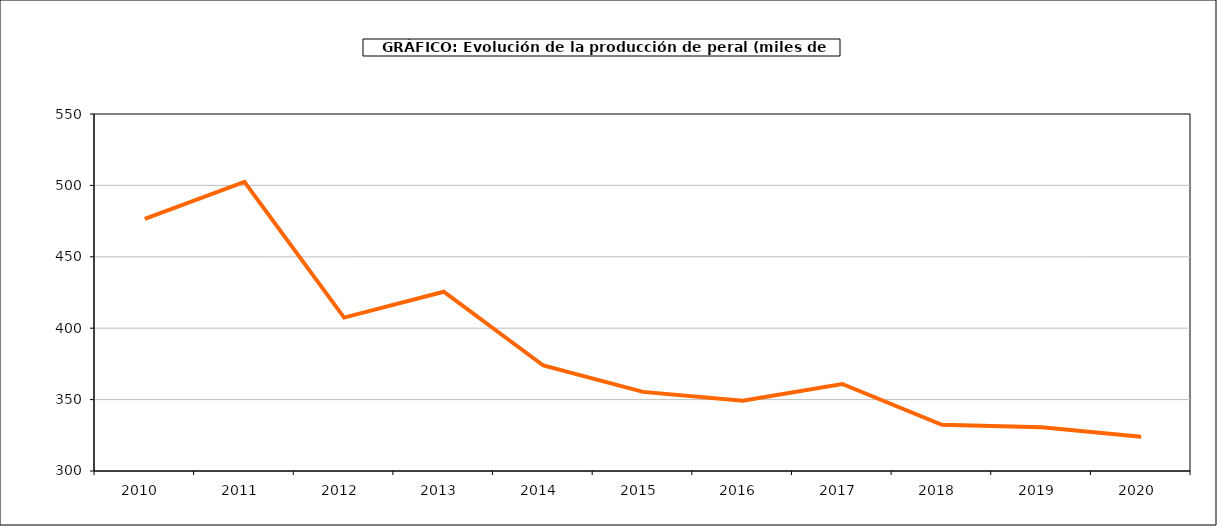
| Category | producción peral |
|---|---|
| 2010.0 | 476.586 |
| 2011.0 | 502.434 |
| 2012.0 | 407.428 |
| 2013.0 | 425.56 |
| 2014.0 | 373.865 |
| 2015.0 | 355.41 |
| 2016.0 | 349.247 |
| 2017.0 | 360.957 |
| 2018.0 | 332.319 |
| 2019.0 | 330.67 |
| 2020.0 | 324.049 |